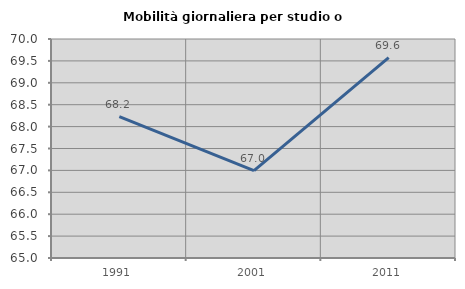
| Category | Mobilità giornaliera per studio o lavoro |
|---|---|
| 1991.0 | 68.228 |
| 2001.0 | 66.995 |
| 2011.0 | 69.576 |